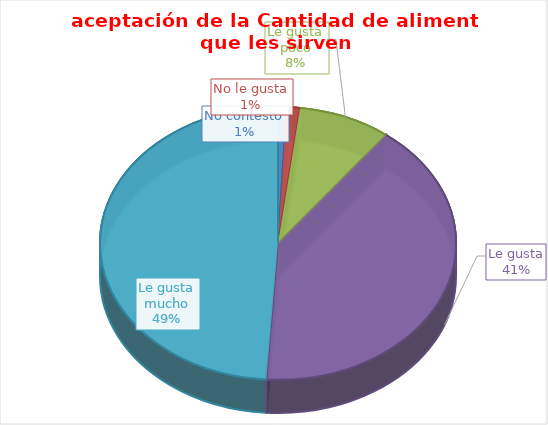
| Category | Series 0 |
|---|---|
| No contesto | 2 |
| No le gusta | 3 |
| Le gusta poco | 21.286 |
| Le gusta | 102.857 |
| Le gusta mucho | 123.857 |